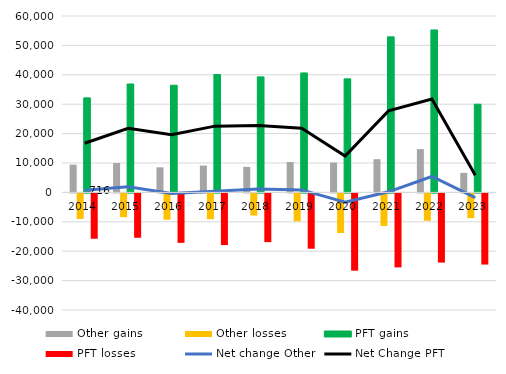
| Category | Other gains | Other losses | PFT gains | PFT losses |
|---|---|---|---|---|
| 2014 | 9435 | -8719 | 32152 | -15421 |
| 2015 | 9988 | -8085 | 36868 | -15094 |
| 2016 | 8534 | -8937 | 36451 | -16826 |
| 2017 | 9124 | -8769 | 40111 | -17570 |
| 2018 | 8682 | -7537 | 39292 | -16576 |
| 2019 | 10327 | -9475 | 40632 | -18817 |
| 2020 | 10151 | -13466 | 38627 | -26288 |
| 2021 | 11288 | -11087 | 52908 | -25167 |
| 2022 | 14720 | -9311 | 55260 | -23528 |
| 2023 | 6641 | -8414 | 30004 | -24198 |